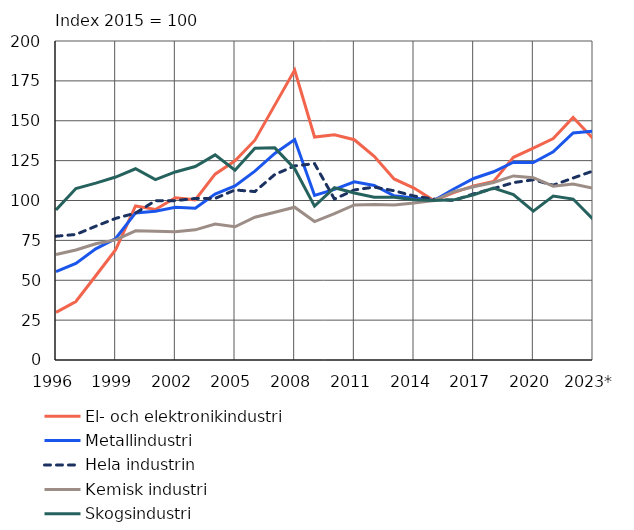
| Category | El- och elektronikindustri | Metallindustri | Hela industrin | Kemisk industri | Skogsindustri |
|---|---|---|---|---|---|
| 1996 | 29.9 | 55.4 | 77.6 | 66.1 | 94.1 |
| 1997 | 36.7 | 60.5 | 78.7 | 69 | 107.5 |
| 1998 | 52.8 | 69.7 | 83.9 | 72.9 | 110.9 |
| 1999 | 69.2 | 76.2 | 88.8 | 75.3 | 114.7 |
| 2000 | 96.6 | 92.2 | 92.1 | 81 | 119.9 |
| 2001 | 94.4 | 93.3 | 99.9 | 80.7 | 113.1 |
| 2002 | 101.7 | 95.7 | 99.9 | 80.4 | 117.9 |
| 2003 | 100.4 | 95.1 | 101.3 | 81.6 | 121.3 |
| 2004 | 116.5 | 104 | 101.3 | 85.3 | 128.6 |
| 2005 | 124.9 | 109.1 | 106.6 | 83.5 | 119 |
| 2006 | 137.8 | 118.4 | 105.6 | 89.5 | 132.7 |
| 2007 | 159.8 | 129.5 | 116.3 | 92.6 | 133 |
| 2008 | 181.8 | 138.2 | 121.7 | 95.8 | 119.9 |
| 2009 | 139.8 | 103.2 | 123.1 | 86.8 | 96.5 |
| 2010 | 141.2 | 107 | 100.9 | 91.8 | 108 |
| 2011 | 138.1 | 111.7 | 106.6 | 97.2 | 104.7 |
| 2012 | 127.7 | 109.4 | 108.4 | 97.5 | 102.1 |
| 2013 | 113.5 | 103 | 106.1 | 97.2 | 102 |
| 2014 | 107.8 | 101.6 | 102.8 | 98.4 | 100.5 |
| 2015 | 100 | 100 | 100.9 | 100 | 100 |
| 2016 | 104.9 | 107.2 | 100 | 105.6 | 100.4 |
| 2017 | 109.2 | 113.8 | 104.2 | 108.6 | 103.6 |
| 2018 | 112 | 118 | 107.5 | 111.3 | 107.8 |
| 2019 | 127.1 | 124 | 111.2 | 115.4 | 103.7 |
| 2020 | 132.8 | 123.8 | 113 | 114.3 | 93.3 |
| 2021 | 138.8 | 130.5 | 109.6 | 109 | 102.8 |
| 2022 | 152.1 | 142.3 | 114.1 | 110.4 | 100.9 |
| 2023* | 138.9 | 143.5 | 118.5 | 107.7 | 88.3 |